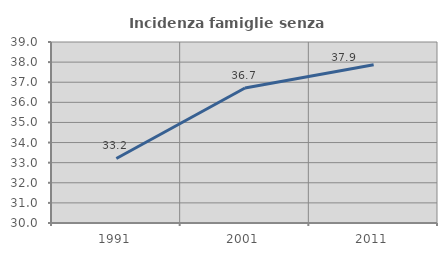
| Category | Incidenza famiglie senza nuclei |
|---|---|
| 1991.0 | 33.208 |
| 2001.0 | 36.713 |
| 2011.0 | 37.868 |